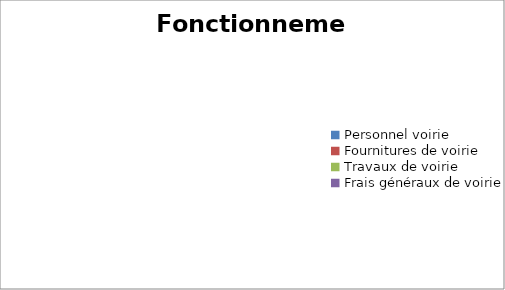
| Category | Series 0 |
|---|---|
| Personnel voirie | 0 |
| Fournitures de voirie | 0 |
| Travaux de voirie | 0 |
| Frais généraux de voirie | 0 |